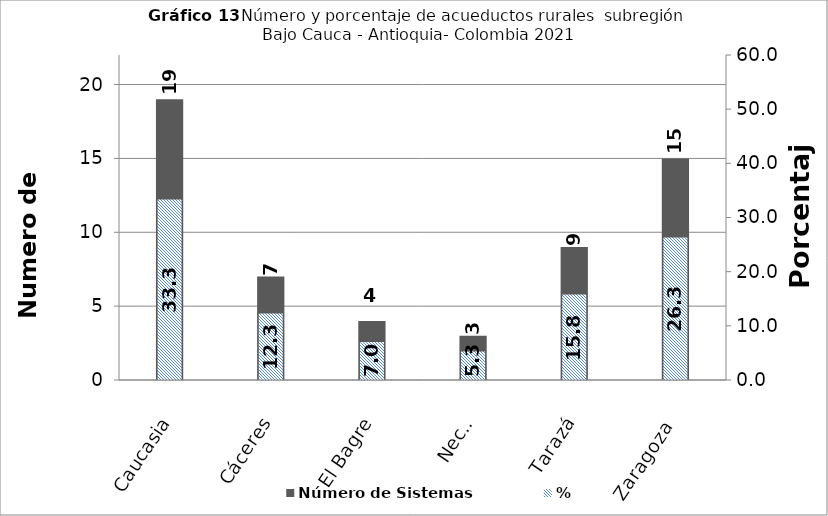
| Category | Número de Sistemas |
|---|---|
| Caucasia | 19 |
| Cáceres | 7 |
| El Bagre | 4 |
| Nechi | 3 |
| Tarazá | 9 |
| Zaragoza | 15 |